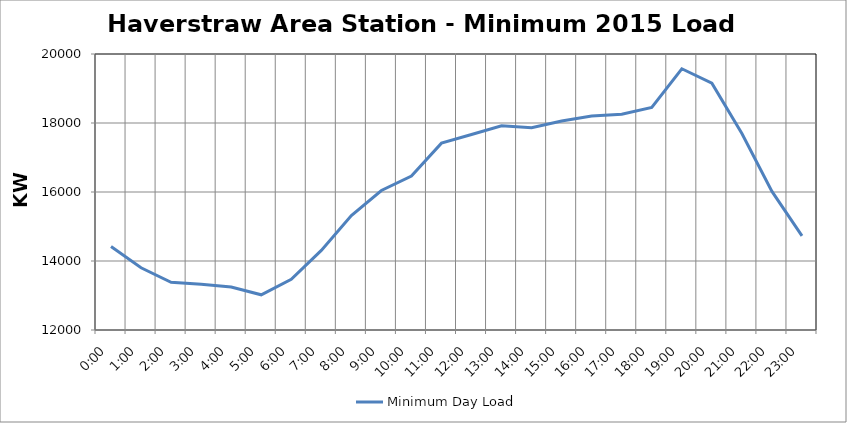
| Category | Minimum Day Load |
|---|---|
| 0.0 | 14420 |
| 0.041666666666666664 | 13804 |
| 0.08333333333333333 | 13384 |
| 0.125 | 13328 |
| 0.16666666666666666 | 13244 |
| 0.20833333333333334 | 13020 |
| 0.25 | 13468 |
| 0.2916666666666667 | 14308 |
| 0.3333333333333333 | 15316 |
| 0.375 | 16044 |
| 0.4166666666666667 | 16464 |
| 0.4583333333333333 | 17416 |
| 0.5 | 17668 |
| 0.5416666666666666 | 17920 |
| 0.5833333333333334 | 17864 |
| 0.625 | 18060 |
| 0.6666666666666666 | 18200 |
| 0.7083333333333334 | 18256 |
| 0.75 | 18452 |
| 0.7916666666666666 | 19572 |
| 0.8333333333333334 | 19152 |
| 0.875 | 17696 |
| 0.9166666666666666 | 16016 |
| 0.9583333333333334 | 14728 |